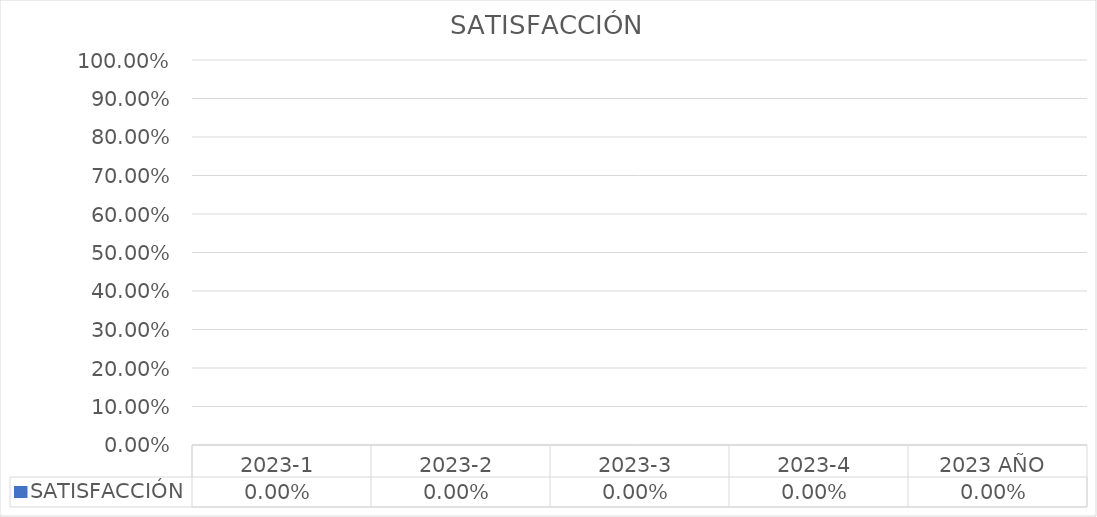
| Category | SATISFACCIÓN |
|---|---|
| 2023-1 | 0 |
| 2023-2 | 0 |
| 2023-3 | 0 |
| 2023-4 | 0 |
| 2023 AÑO | 0 |